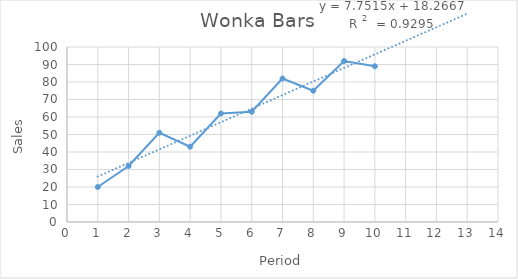
| Category | Sales |
|---|---|
| 1.0 | 20 |
| 2.0 | 32 |
| 3.0 | 51 |
| 4.0 | 43 |
| 5.0 | 62 |
| 6.0 | 63 |
| 7.0 | 82 |
| 8.0 | 75 |
| 9.0 | 92 |
| 10.0 | 89 |